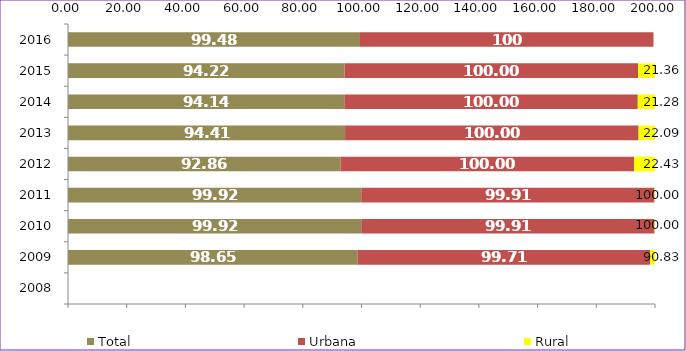
| Category | Total | Urbana | Rural |
|---|---|---|---|
| 2008.0 | 0 | 0 | 0 |
| 2009.0 | 98.65 | 99.71 | 90.83 |
| 2010.0 | 99.92 | 99.91 | 100 |
| 2011.0 | 99.92 | 99.91 | 100 |
| 2012.0 | 92.86 | 100 | 22.43 |
| 2013.0 | 94.41 | 100 | 22.09 |
| 2014.0 | 94.14 | 100 | 21.28 |
| 2015.0 | 94.22 | 100 | 21.36 |
| 2016.0 | 99.48 | 100 | 0 |